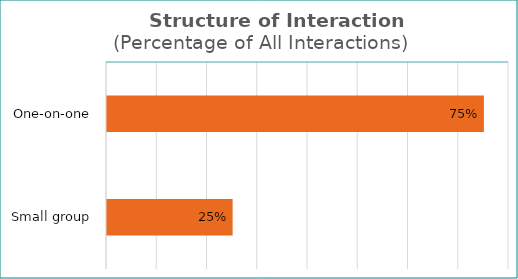
| Category | Series 0 |
|---|---|
| One-on-one | 0.75 |
| Small group | 0.25 |